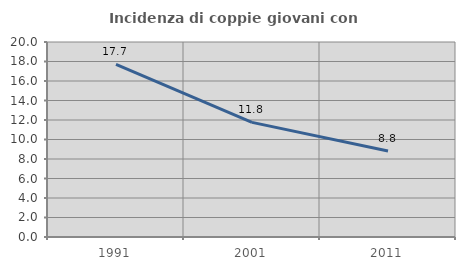
| Category | Incidenza di coppie giovani con figli |
|---|---|
| 1991.0 | 17.716 |
| 2001.0 | 11.755 |
| 2011.0 | 8.821 |